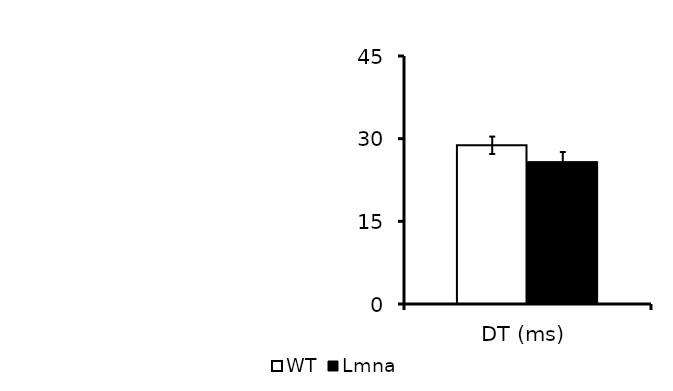
| Category | WT | Lmna |
|---|---|---|
| 0 | 28.796 | 25.833 |